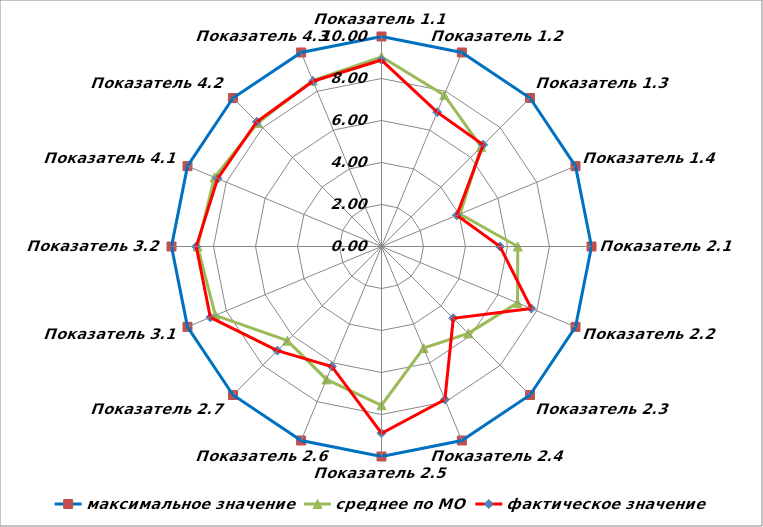
| Category | максимальное значение | среднее по МО | фактическое значение |
|---|---|---|---|
| Показатель 1.1 | 10 | 9.033 | 8.879 |
| Показатель 1.2 | 10 | 7.803 | 6.925 |
| Показатель 1.3 | 10 | 6.713 | 6.85 |
| Показатель 1.4 | 10 | 4.051 | 3.882 |
| Показатель 2.1 | 10 | 6.489 | 5.643 |
| Показатель 2.2 | 10 | 7.011 | 7.721 |
| Показатель 2.3 | 10 | 5.851 | 4.834 |
| Показатель 2.4 | 10 | 5.239 | 7.886 |
| Показатель 2.5 | 10 | 7.56 | 8.891 |
| Показатель 2.6 | 10 | 6.849 | 6.182 |
| Показатель 2.7 | 10 | 6.342 | 7.012 |
| Показатель 3.1 | 10 | 8.563 | 8.822 |
| Показатель 3.2 | 10 | 8.76 | 8.822 |
| Показатель 4.1 | 10 | 8.608 | 8.447 |
| Показатель 4.2 | 10 | 8.323 | 8.401 |
| Показатель 4.3 | 10 | 8.551 | 8.519 |